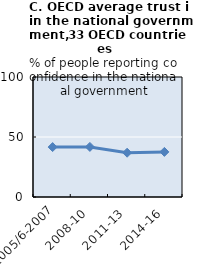
| Category | OECD 33 |
|---|---|
| 2005/6-2007 | 41.592 |
| 2008-10 | 41.739 |
| 2011-13 | 36.912 |
| 2014-16 | 37.594 |